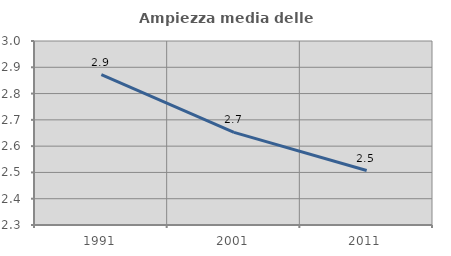
| Category | Ampiezza media delle famiglie |
|---|---|
| 1991.0 | 2.872 |
| 2001.0 | 2.653 |
| 2011.0 | 2.507 |